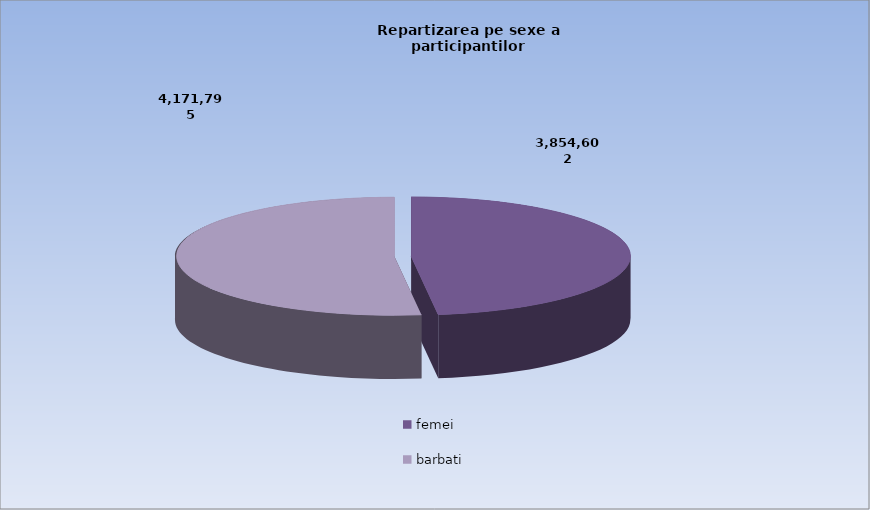
| Category | Series 0 |
|---|---|
| femei | 3854602 |
| barbati | 4171795 |